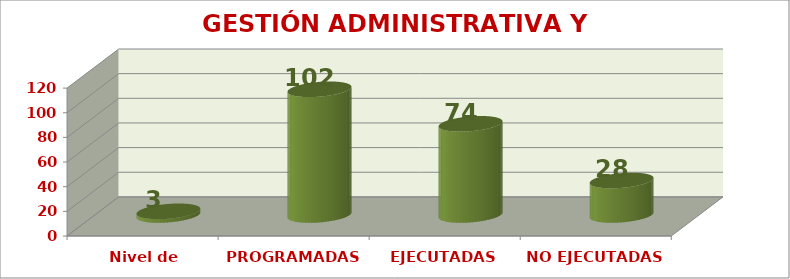
| Category | GESTIÓN ADMINISTRATIVA Y FINANCIERA |
|---|---|
| Nivel de satisfacción | 3 |
| PROGRAMADAS | 102 |
| EJECUTADAS | 74 |
| NO EJECUTADAS | 28 |